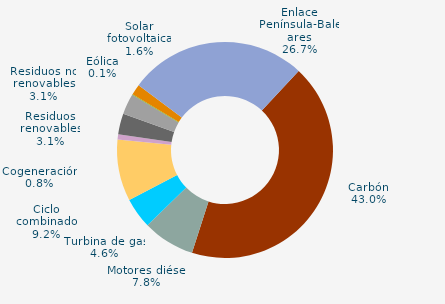
| Category | Series 0 |
|---|---|
| Carbón | 43 |
| Motores diésel | 7.8 |
| Turbina de gas | 4.6 |
| Ciclo combinado | 9.2 |
| Generación auxiliar | 0 |
| Cogeneración | 0.8 |
| Residuos no renovables | 3.1 |
| Residuos renovables | 3.1 |
| Eólica | 0.1 |
| Solar fotovoltaica | 1.6 |
| Otras renovables | 0 |
| Enlace Península-Baleares | 26.7 |